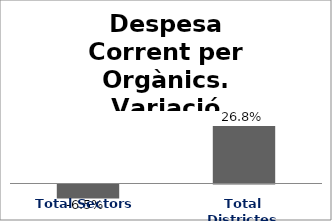
| Category | Series 0 |
|---|---|
| Total Sectors | -0.065 |
| Total Districtes | 0.268 |